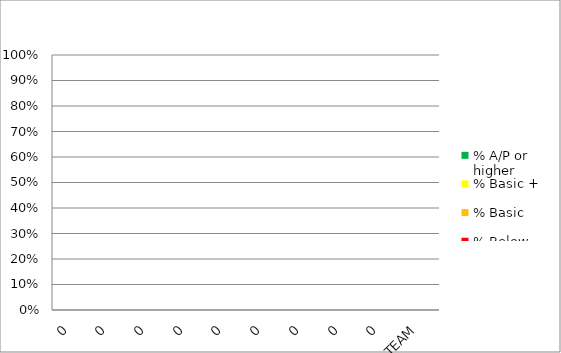
| Category | % A/P or higher | % Basic + | % Basic  | % Below Basic |
|---|---|---|---|---|
| 0 | 0 | 0 | 0 | 0 |
| 0 | 0 | 0 | 0 | 0 |
| 0 | 0 | 0 | 0 | 0 |
| 0 | 0 | 0 | 0 | 0 |
| 0 | 0 | 0 | 0 | 0 |
| 0 | 0 | 0 | 0 | 0 |
| 0 | 0 | 0 | 0 | 0 |
| 0 | 0 | 0 | 0 | 0 |
| 0 | 0 | 0 | 0 | 0 |
| TEAM | 0 | 0 | 0 | 0 |